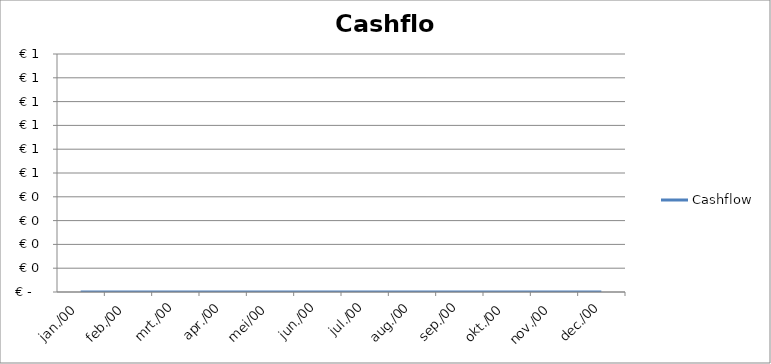
| Category | Cashflow |
|---|---|
| 1900-01-01 | 0 |
| 1900-02-01 | 0 |
| 1900-03-01 | 0 |
| 1900-04-01 | 0 |
| 1900-05-01 | 0 |
| 1900-06-01 | 0 |
| 1900-07-01 | 0 |
| 1900-08-01 | 0 |
| 1900-09-01 | 0 |
| 1900-10-01 | 0 |
| 1900-11-01 | 0 |
| 1900-12-01 | 0 |